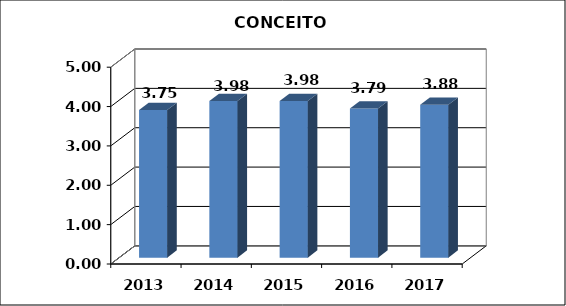
| Category | Series 0 |
|---|---|
| 2013.0 | 3.75 |
| 2014.0 | 3.977 |
| 2015.0 | 3.978 |
| 2016.0 | 3.788 |
| 2017.0 | 3.882 |